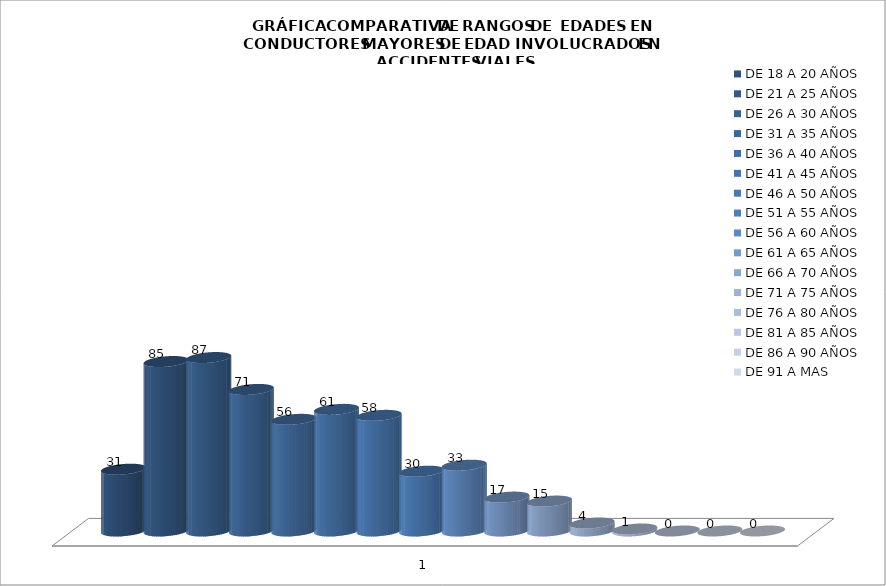
| Category | DE 18 A 20 AÑOS | DE 21 A 25 AÑOS | DE 26 A 30 AÑOS | DE 31 A 35 AÑOS | DE 36 A 40 AÑOS | DE 41 A 45 AÑOS | DE 46 A 50 AÑOS | DE 51 A 55 AÑOS | DE 56 A 60 AÑOS | DE 61 A 65 AÑOS | DE 66 A 70 AÑOS | DE 71 A 75 AÑOS | DE 76 A 80 AÑOS | DE 81 A 85 AÑOS | DE 86 A 90 AÑOS | DE 91 A MAS |
|---|---|---|---|---|---|---|---|---|---|---|---|---|---|---|---|---|
| 0 | 31 | 85 | 87 | 71 | 56 | 61 | 58 | 30 | 33 | 17 | 15 | 4 | 1 | 0 | 0 | 0 |